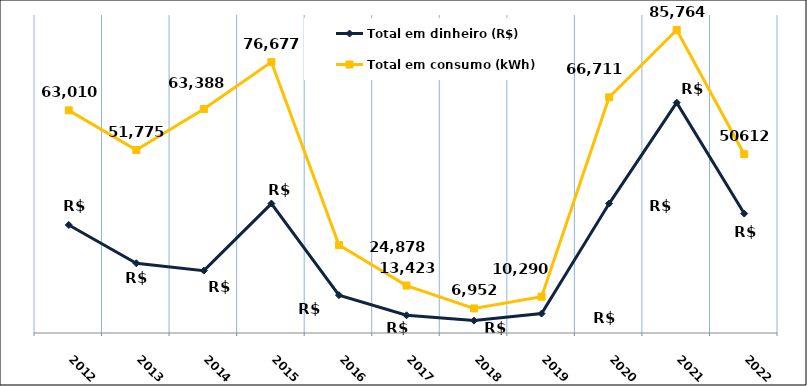
| Category | Total em dinheiro (R$) | Total em consumo (kWh) |
|---|---|---|
| 2012.0 | 30573.18 | 63010 |
| 2013.0 | 19732.31 | 51775 |
| 2014.0 | 17653.96 | 63388 |
| 2015.0 | 36633.46 | 76677 |
| 2016.0 | 10702.76 | 24878 |
| 2017.0 | 5021.46 | 13423 |
| 2018.0 | 3506.63 | 6952 |
| 2019.0 | 5488.54 | 10290 |
| 2020.0 | 36633.97 | 66711 |
| 2021.0 | 65195 | 85764 |
| 2022.0 | 33801.18 | 50612 |